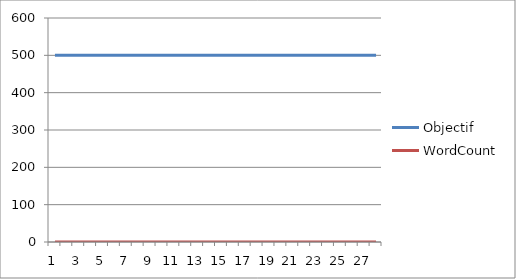
| Category | Objectif | WordCount |
|---|---|---|
| 0 | 500 | 0 |
| 1 | 500 | 0 |
| 2 | 500 | 0 |
| 3 | 500 | 0 |
| 4 | 500 | 0 |
| 5 | 500 | 0 |
| 6 | 500 | 0 |
| 7 | 500 | 0 |
| 8 | 500 | 0 |
| 9 | 500 | 0 |
| 10 | 500 | 0 |
| 11 | 500 | 0 |
| 12 | 500 | 0 |
| 13 | 500 | 0 |
| 14 | 500 | 0 |
| 15 | 500 | 0 |
| 16 | 500 | 0 |
| 17 | 500 | 0 |
| 18 | 500 | 0 |
| 19 | 500 | 0 |
| 20 | 500 | 0 |
| 21 | 500 | 0 |
| 22 | 500 | 0 |
| 23 | 500 | 0 |
| 24 | 500 | 0 |
| 25 | 500 | 0 |
| 26 | 500 | 0 |
| 27 | 500 | 0 |